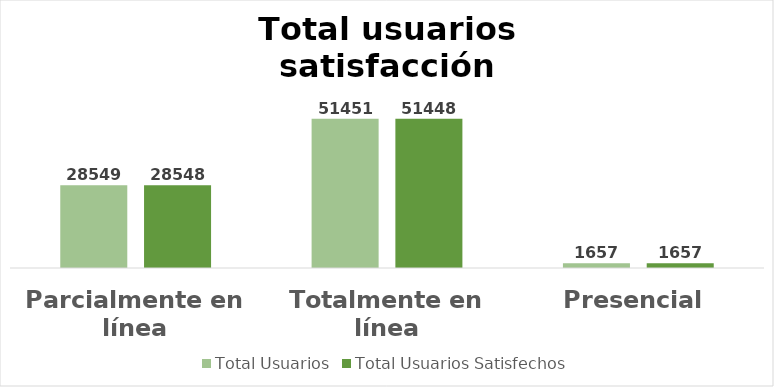
| Category | Total Usuarios | Total Usuarios Satisfechos |
|---|---|---|
| 0 | 28549 | 28548 |
| 1 | 51451 | 51448 |
| 2 | 1657 | 1657 |